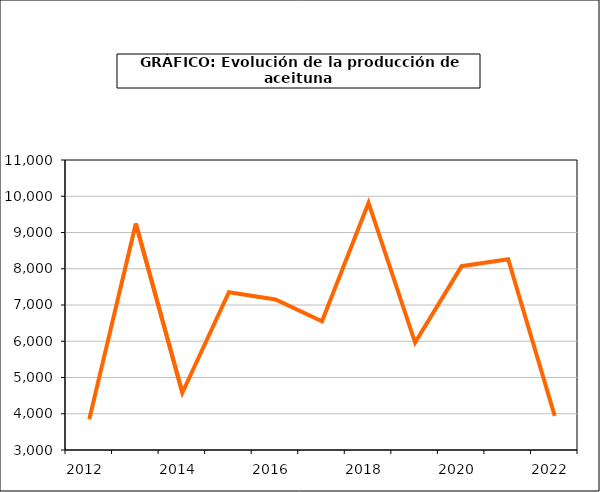
| Category | Series 0 |
|---|---|
| 2012.0 | 3849.263 |
| 2013.0 | 9250.61 |
| 2014.0 | 4579.208 |
| 2015.0 | 7352.095 |
| 2016.0 | 7154.076 |
| 2017.0 | 6549.499 |
| 2018.0 | 9819.569 |
| 2019.0 | 5965.077 |
| 2020.0 | 8069.983 |
| 2021.0 | 8261.231 |
| 2022.0 | 3940.067 |